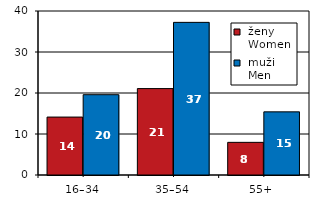
| Category |  ženy 
 Women |  muži 
 Men |
|---|---|---|
| 16–34 | 14.13 | 19.588 |
| 35–54 | 21.078 | 37.228 |
| 55+  | 7.964 | 15.403 |